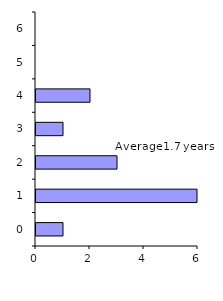
| Category | Series 0 |
|---|---|
| 0.0 | 1 |
| 1.0 | 7 |
| 2.0 | 3 |
| 3.0 | 1 |
| 4.0 | 2 |
| 5.0 | 0 |
| 6.0 | 0 |